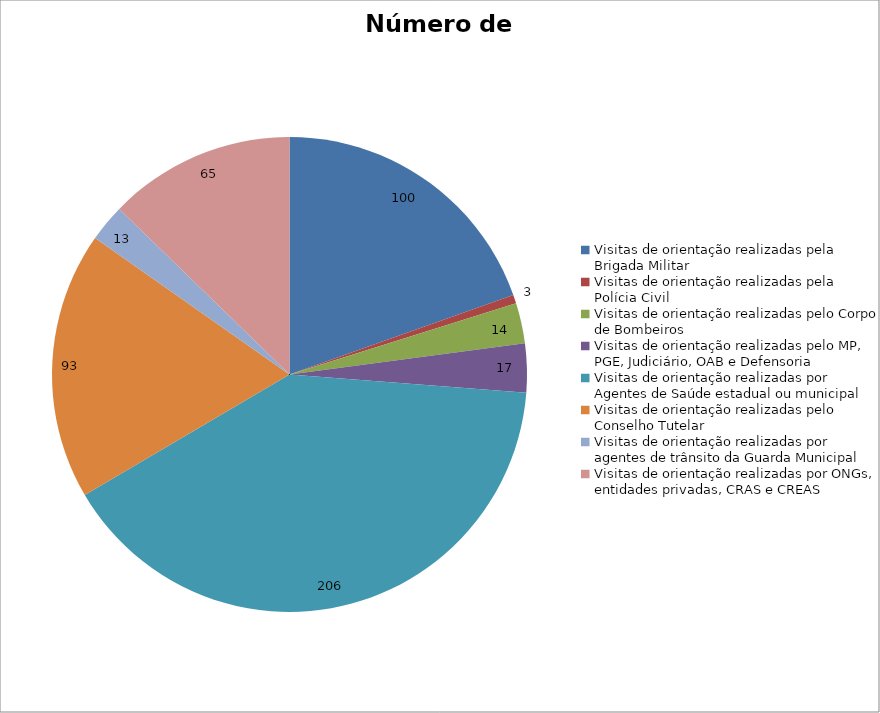
| Category | Número de Ações |
|---|---|
| Visitas de orientação realizadas pela Brigada Militar | 100 |
| Visitas de orientação realizadas pela Polícia Civil | 3 |
| Visitas de orientação realizadas pelo Corpo de Bombeiros | 14 |
| Visitas de orientação realizadas pelo MP, PGE, Judiciário, OAB e Defensoria | 17 |
| Visitas de orientação realizadas por Agentes de Saúde estadual ou municipal | 206 |
| Visitas de orientação realizadas pelo Conselho Tutelar | 93 |
| Visitas de orientação realizadas por agentes de trânsito da Guarda Municipal | 13 |
| Visitas de orientação realizadas por ONGs, entidades privadas, CRAS e CREAS | 65 |